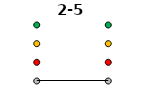
| Category | 0 | 1 | 2 | 3 | 2-5 |
|---|---|---|---|---|---|
| Time 1 | 0 | 1 | 2 | 3 | 0 |
| Time 2 | 0 | 1 | 2 | 3 | 0 |